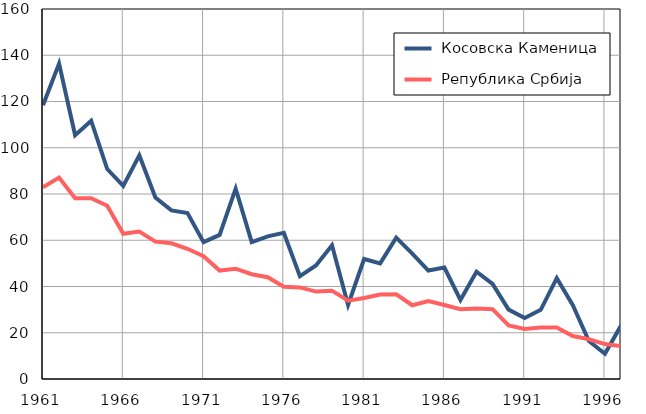
| Category |  Косовска Каменица |  Република Србија |
|---|---|---|
| 1961.0 | 118.4 | 82.9 |
| 1962.0 | 136.4 | 87.1 |
| 1963.0 | 105.4 | 78.2 |
| 1964.0 | 111.7 | 78.2 |
| 1965.0 | 90.8 | 74.9 |
| 1966.0 | 83.5 | 62.8 |
| 1967.0 | 96.7 | 63.8 |
| 1968.0 | 78.5 | 59.4 |
| 1969.0 | 72.9 | 58.7 |
| 1970.0 | 71.8 | 56.3 |
| 1971.0 | 59.2 | 53.1 |
| 1972.0 | 62.3 | 46.9 |
| 1973.0 | 82.3 | 47.7 |
| 1974.0 | 59.2 | 45.3 |
| 1975.0 | 61.7 | 44 |
| 1976.0 | 63.2 | 39.9 |
| 1977.0 | 44.5 | 39.6 |
| 1978.0 | 49.1 | 37.8 |
| 1979.0 | 57.8 | 38.2 |
| 1980.0 | 32 | 33.9 |
| 1981.0 | 51.9 | 35 |
| 1982.0 | 50 | 36.5 |
| 1983.0 | 61.1 | 36.6 |
| 1984.0 | 54.2 | 31.9 |
| 1985.0 | 46.9 | 33.7 |
| 1986.0 | 48.2 | 32 |
| 1987.0 | 34.2 | 30.2 |
| 1988.0 | 46.4 | 30.5 |
| 1989.0 | 41.1 | 30.2 |
| 1990.0 | 30 | 23.2 |
| 1991.0 | 26.4 | 21.6 |
| 1992.0 | 29.9 | 22.3 |
| 1993.0 | 43.6 | 22.3 |
| 1994.0 | 31.9 | 18.6 |
| 1995.0 | 16.4 | 17.2 |
| 1996.0 | 10.9 | 15.1 |
| 1997.0 | 23.1 | 14.2 |